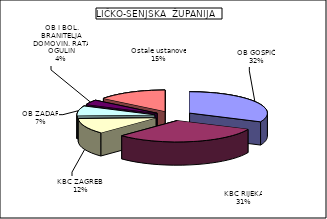
| Category | Series 0 |
|---|---|
| OB GOSPIĆ | 31.699 |
| KBC RIJEKA | 30.861 |
| KBC ZAGREB  | 11.845 |
| OB ZADAR | 7.427 |
| OB I BOL. BRANITELJA DOMOVIN. RATA OGULIN | 3.599 |
| Ostale ustanove | 14.569 |